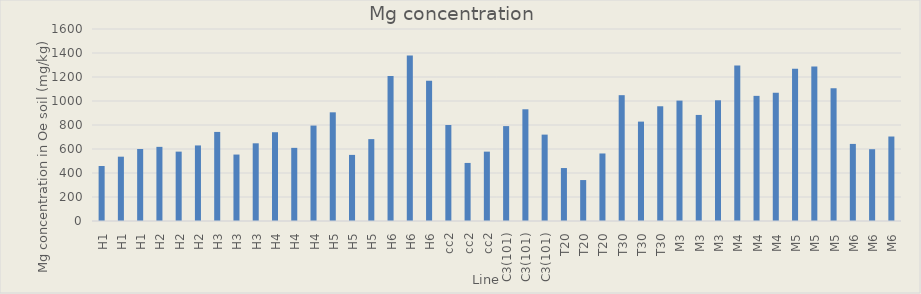
| Category | Series 0 |
|---|---|
| H1 | 458.175 |
| H1 | 535.956 |
| H1 | 600.219 |
| H2 | 617.861 |
| H2 | 578.078 |
| H2 | 629.7 |
| H3 | 742.241 |
| H3 | 553.714 |
| H3 | 647.444 |
| H4 | 739.786 |
| H4 | 609.499 |
| H4 | 795.194 |
| H5 | 905.674 |
| H5 | 550.859 |
| H5 | 682.333 |
| H6 | 1209.231 |
| H6 | 1379.52 |
| H6 | 1169.004 |
| cc2 | 800.086 |
| cc2 | 483.867 |
| cc2 | 578.052 |
| C3(101) | 790.833 |
| C3(101) | 930.991 |
| C3(101) | 719.855 |
| T20 | 441.327 |
| T20 | 341.192 |
| T20 | 562.731 |
| T30 | 1048.568 |
| T30 | 828.222 |
| T30 | 956.09 |
| M3 | 1003.236 |
| M3 | 883.838 |
| M3 | 1005.985 |
| M4 | 1296.584 |
| M4 | 1042.79 |
| M4 | 1067.724 |
| M5 | 1269.67 |
| M5 | 1288.24 |
| M5 | 1106.078 |
| M6 | 642.411 |
| M6 | 598.22 |
| M6 | 704.065 |